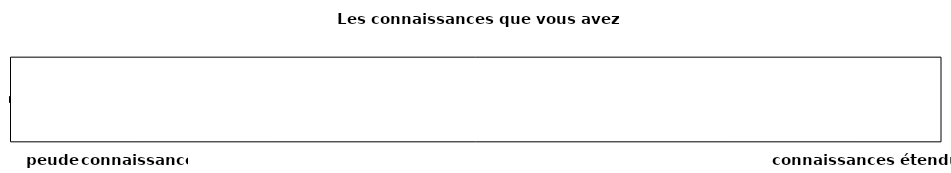
| Category | kennis uit opleiding | beroepskennis | interesse in financiën | maximale score |
|---|---|---|---|---|
| 0 | 0 | 0 | 0 | 1 |